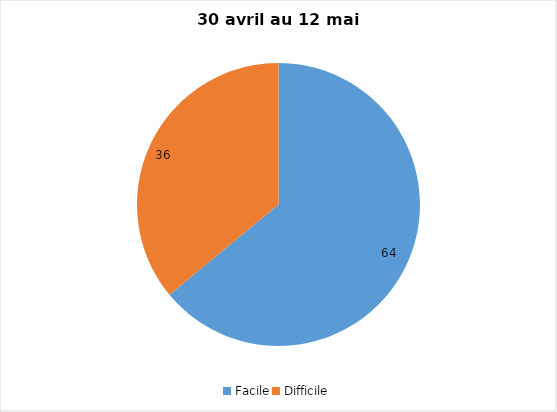
| Category | Series 0 |
|---|---|
| Facile | 64 |
| Difficile | 36 |